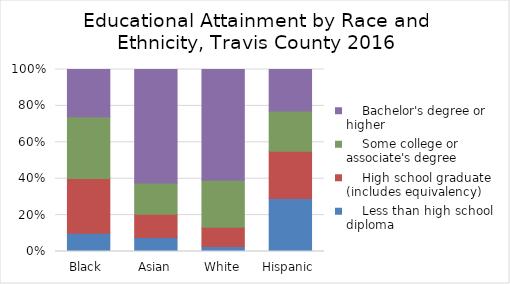
| Category |     Less than high school diploma |     High school graduate (includes equivalency) |     Some college or associate's degree |     Bachelor's degree or higher |
|---|---|---|---|---|
| Black  | 0.1 | 0.301 | 0.339 | 0.26 |
| Asian | 0.077 | 0.127 | 0.172 | 0.624 |
| White | 0.028 | 0.106 | 0.257 | 0.609 |
| Hispanic | 0.292 | 0.259 | 0.221 | 0.228 |